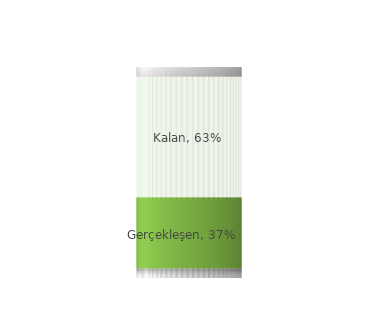
| Category | Üst kapak | Gerçekleşen | Kalan | Alt kapak |
|---|---|---|---|---|
| 0 | 0.05 | 0.37 | 0.63 | 0.05 |